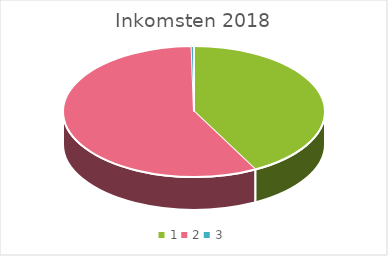
| Category | Series 0 |
|---|---|
| 0 | 2150 |
| 1 | 2922 |
| 2 | 15 |